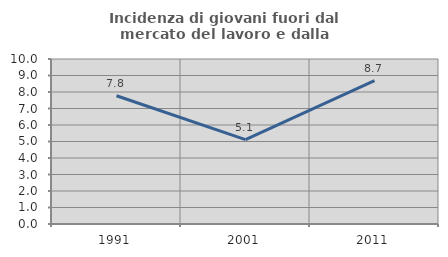
| Category | Incidenza di giovani fuori dal mercato del lavoro e dalla formazione  |
|---|---|
| 1991.0 | 7.772 |
| 2001.0 | 5.11 |
| 2011.0 | 8.691 |